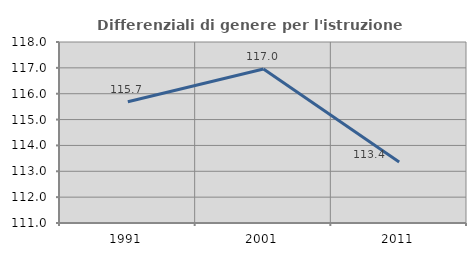
| Category | Differenziali di genere per l'istruzione superiore |
|---|---|
| 1991.0 | 115.688 |
| 2001.0 | 116.955 |
| 2011.0 | 113.361 |